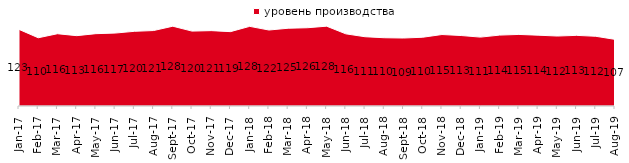
| Category | уровень производства |
|---|---|
| 2017-01-01 | 122.95 |
| 2017-02-01 | 109.5 |
| 2017-03-01 | 116 |
| 2017-04-01 | 112.9 |
| 2017-05-01 | 116.1 |
| 2017-06-01 | 117.05 |
| 2017-07-01 | 119.85 |
| 2017-08-01 | 121.1 |
| 2017-09-01 | 128.05 |
| 2017-10-01 | 120.2 |
| 2017-11-01 | 120.95 |
| 2017-12-01 | 119.35 |
| 2018-01-01 | 127.8 |
| 2018-02-01 | 121.95 |
| 2018-03-01 | 124.8 |
| 2018-04-01 | 125.6 |
| 2018-05-01 | 128.1 |
| 2018-06-01 | 115.8 |
| 2018-07-01 | 111.15 |
| 2018-08-01 | 109.55 |
| 2018-09-01 | 109.1 |
| 2018-10-01 | 110.35 |
| 2018-11-01 | 114.721 |
| 2018-12-01 | 113.1 |
| 2019-01-01 | 110.55 |
| 2019-02-01 | 113.8 |
| 2019-03-01 | 114.868 |
| 2019-04-01 | 113.663 |
| 2019-05-01 | 112.283 |
| 2019-06-01 | 113.367 |
| 2019-07-01 | 111.881 |
| 2019-08-01 | 106.943 |